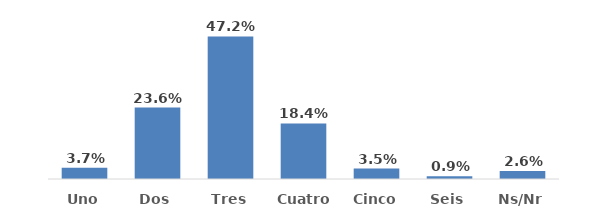
| Category | Series 0 |
|---|---|
| Uno | 0.037 |
| Dos | 0.236 |
| Tres | 0.472 |
| Cuatro | 0.184 |
| Cinco | 0.035 |
| Seis | 0.009 |
| Ns/Nr | 0.026 |